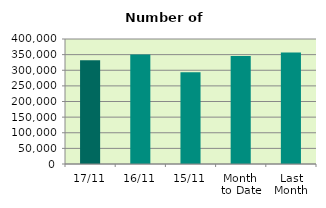
| Category | Series 0 |
|---|---|
| 17/11 | 331652 |
| 16/11 | 350538 |
| 15/11 | 293746 |
| Month 
to Date | 345217.692 |
| Last
Month | 357160.667 |